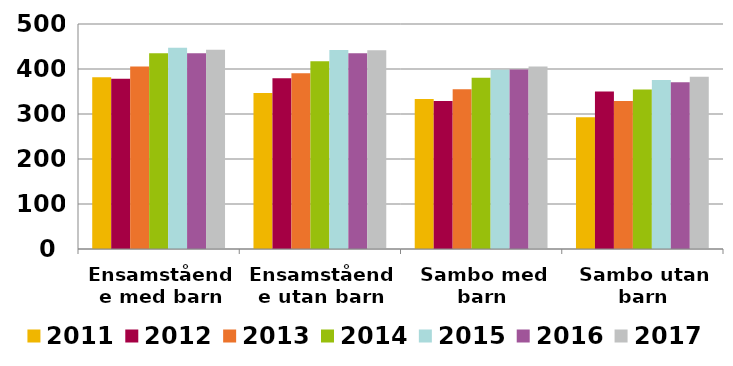
| Category | 2011 | 2012 | 2013 | 2014 | 2015 | 2016 | 2017 |
|---|---|---|---|---|---|---|---|
| Ensamstående med barn | 381.791 | 378.584 | 405.762 | 434.895 | 447.36 | 435.119 | 442.727 |
| Ensamstående utan barn | 346.716 | 379.256 | 390.535 | 417.192 | 442.03 | 435.233 | 441.855 |
| Sambo med barn | 333.181 | 328.911 | 355.065 | 380.533 | 398.305 | 398.712 | 405.513 |
| Sambo utan barn | 292.853 | 350.069 | 328.734 | 354.665 | 375.671 | 370.493 | 382.902 |